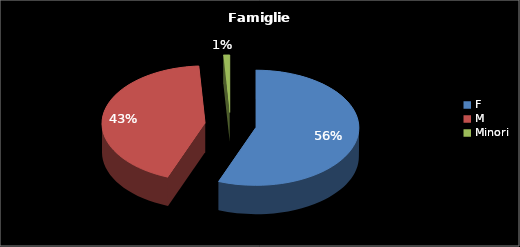
| Category | Series 0 |
|---|---|
| F | 286 |
| M | 221 |
| Minori | 5 |